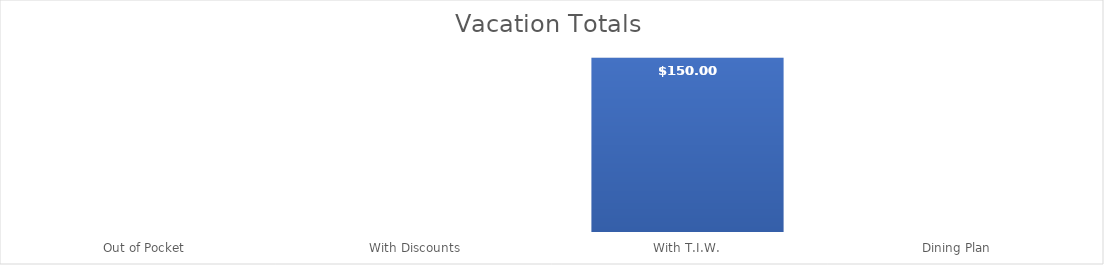
| Category | Series 0 |
|---|---|
| Out of Pocket | 0 |
| With Discounts | 0 |
| With T.I.W. | 150 |
| Dining Plan | 0 |